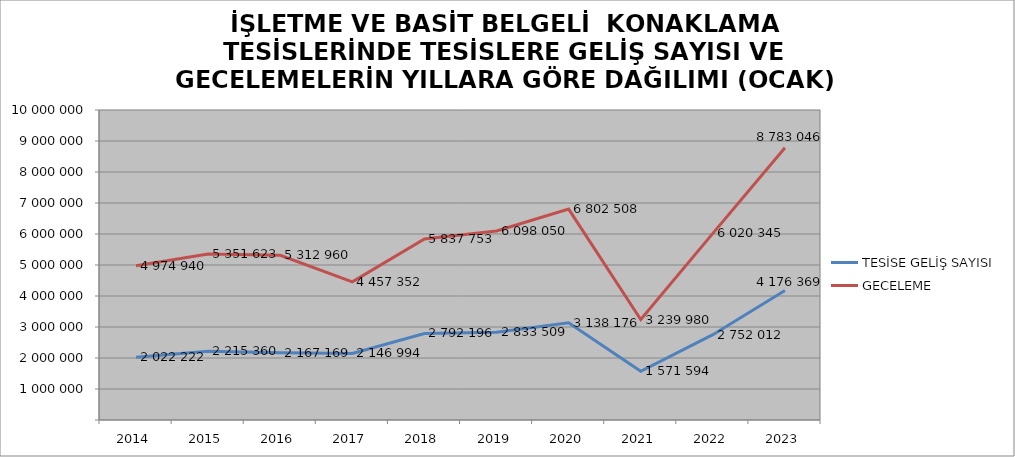
| Category | TESİSE GELİŞ SAYISI | GECELEME |
|---|---|---|
| 2014 | 2022222 | 4974940 |
| 2015 | 2215360 | 5351623 |
| 2016 | 2167169 | 5312960 |
| 2017 | 2146994 | 4457352 |
| 2018 | 2792196 | 5837753 |
| 2019 | 2833509 | 6098050 |
| 2020 | 3138176 | 6802508 |
| 2021 | 1571594 | 3239980 |
| 2022 | 2752012 | 6020345 |
| 2023 | 4176369 | 8783046 |